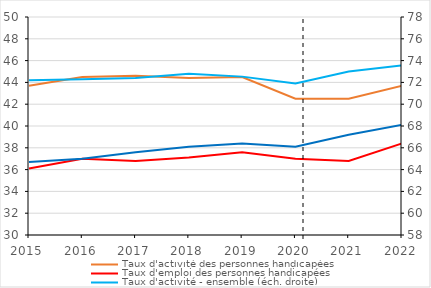
| Category | Taux d'activité des personnes handicapées | Taux d'emploi des personnes handicapées |
|---|---|---|
| 2015.0 | 43.7 | 36.1 |
| 2016.0 | 44.5 | 37 |
| 2017.0 | 44.6 | 36.8 |
| 2018.0 | 44.4 | 37.1 |
| 2019.0 | 44.5 | 37.6 |
| 2020.0 | 42.5 | 37 |
| 2021.0 | 42.5 | 36.8 |
| 2022.0 | 43.7 | 38.4 |